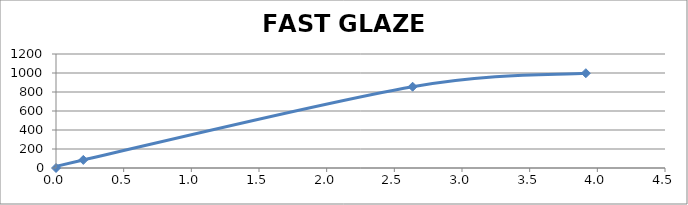
| Category | FAST GLAZE CHART |
|---|---|
| 0.0 | 0 |
| 0.201754385964912 | 85 |
| 2.635087719298245 | 855.556 |
| 3.915087719298246 | 997.778 |